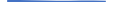
| Category | Series 0 |
|---|---|
| 0 | 9 |
| 1 | 10 |
| 2 | 7 |
| 3 | 5 |
| 4 | 3 |
| 5 | 2 |
| 6 | 5 |
| 7 | 5 |
| 8 | 3 |